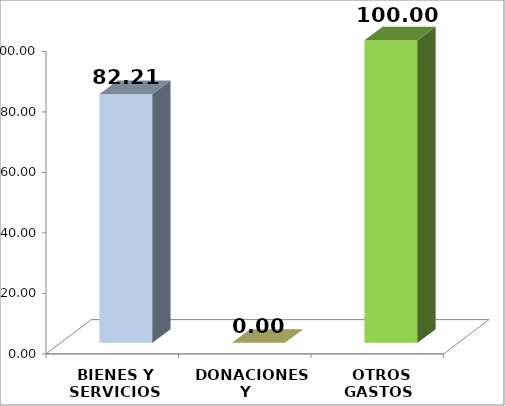
| Category | Series 0 |
|---|---|
|  BIENES Y SERVICIOS | 82.208 |
|   DONACIONES Y TRANSFERENCIAS | 0 |
|  OTROS GASTOS | 100 |